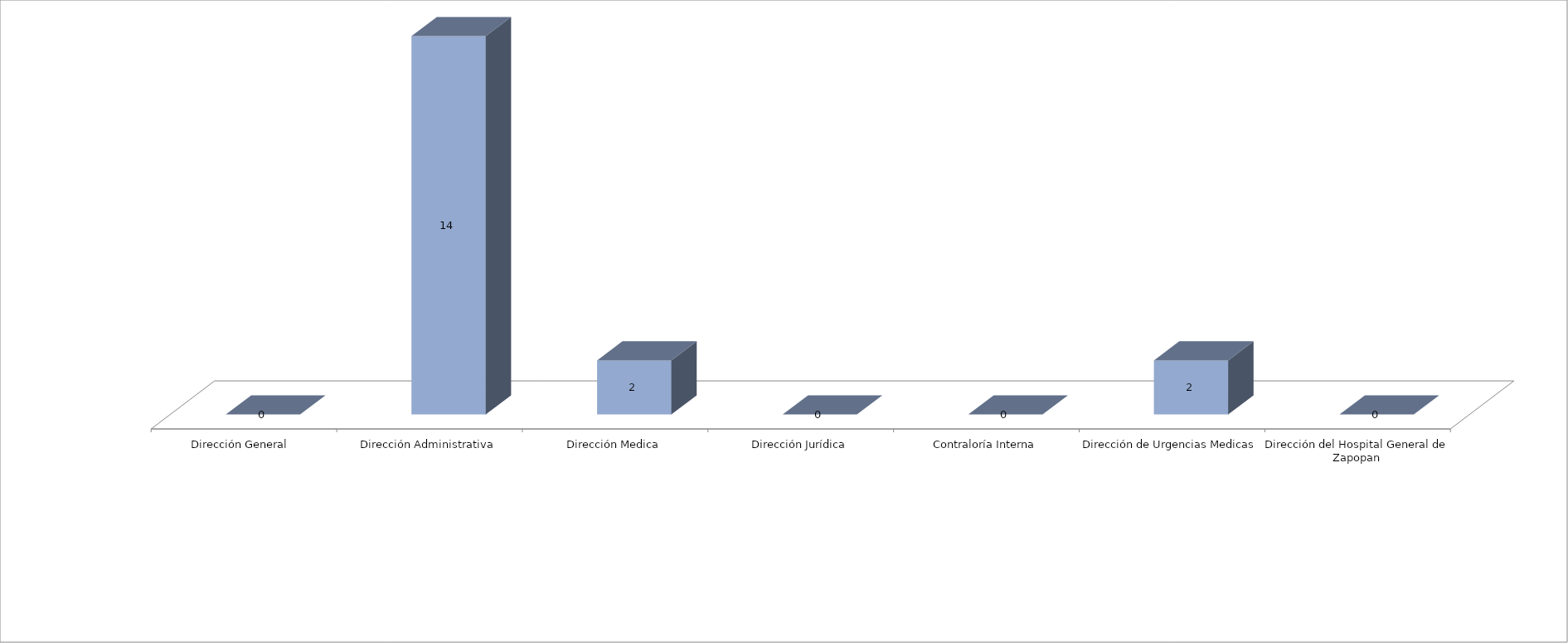
| Category | Series 0 | Series 1 |
|---|---|---|
| Dirección General  |  | 0 |
| Dirección Administrativa |  | 14 |
| Dirección Medica |  | 2 |
| Dirección Jurídica |  | 0 |
| Contraloría Interna |  | 0 |
| Dirección de Urgencias Medicas |  | 2 |
| Dirección del Hospital General de Zapopan |  | 0 |